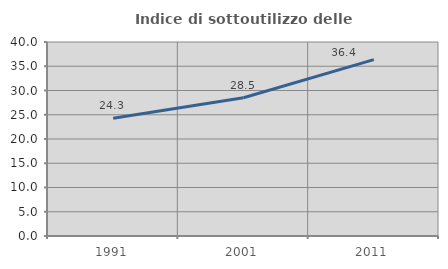
| Category | Indice di sottoutilizzo delle abitazioni  |
|---|---|
| 1991.0 | 24.257 |
| 2001.0 | 28.509 |
| 2011.0 | 36.364 |